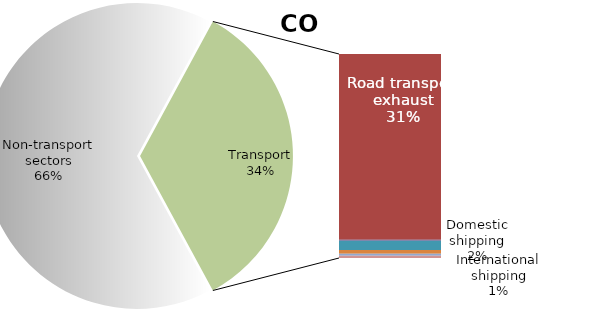
| Category | Series 0 |
|---|---|
| Non-transport sectors | 17663.855 |
| Road transport exhaust | 8362.983 |
| Road transport non-exhaust | 0 |
| Railways | 42.651 |
| Domestic shipping | 411.852 |
| International shipping | 177.992 |
| Domestic aviation | 88.28 |
| International aviation | 98.052 |